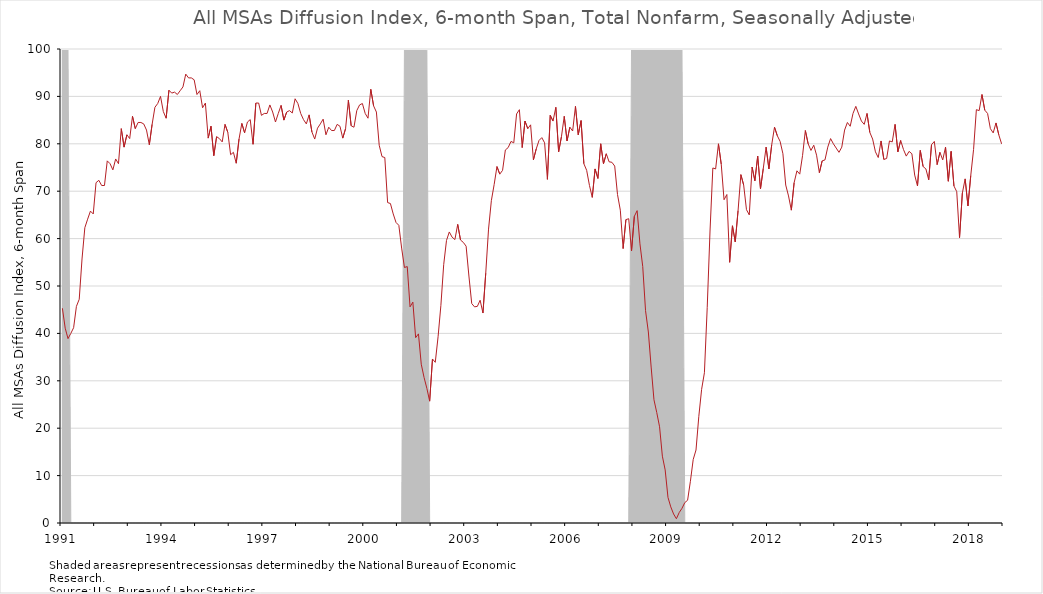
| Category | DI_6month |
|---|---|
| 1991 | 45.3 |
| 1991 | 41.1 |
| 1991 | 38.9 |
| 1991 | 40 |
| 1991 | 41.2 |
| 1991 | 45.7 |
| 1991 | 47.2 |
| 1991 | 55.7 |
| 1991 | 62.3 |
| 1991 | 64.1 |
| 1991 | 65.8 |
| 1991 | 65.2 |
| 1992 | 71.8 |
| 1992 | 72.3 |
| 1992 | 71.2 |
| 1992 | 71.2 |
| 1992 | 76.4 |
| 1992 | 75.8 |
| 1992 | 74.5 |
| 1992 | 76.8 |
| 1992 | 75.8 |
| 1992 | 83.2 |
| 1992 | 79.3 |
| 1992 | 81.9 |
| 1993 | 81.1 |
| 1993 | 85.8 |
| 1993 | 83.2 |
| 1993 | 84.5 |
| 1993 | 84.5 |
| 1993 | 84.2 |
| 1993 | 82.9 |
| 1993 | 79.8 |
| 1993 | 84.1 |
| 1993 | 87.7 |
| 1993 | 88.5 |
| 1993 | 90 |
| 1994 | 86.8 |
| 1994 | 85.4 |
| 1994 | 91.3 |
| 1994 | 90.7 |
| 1994 | 90.9 |
| 1994 | 90.4 |
| 1994 | 91.2 |
| 1994 | 92 |
| 1994 | 94.7 |
| 1994 | 93.9 |
| 1994 | 93.9 |
| 1994 | 93.5 |
| 1995 | 90.4 |
| 1995 | 91.2 |
| 1995 | 87.6 |
| 1995 | 88.6 |
| 1995 | 81.2 |
| 1995 | 83.7 |
| 1995 | 77.5 |
| 1995 | 81.5 |
| 1995 | 81.1 |
| 1995 | 80.4 |
| 1995 | 84.1 |
| 1995 | 82.4 |
| 1996 | 77.7 |
| 1996 | 78.2 |
| 1996 | 75.9 |
| 1996 | 81 |
| 1996 | 84.3 |
| 1996 | 82.3 |
| 1996 | 84.6 |
| 1996 | 85.1 |
| 1996 | 79.9 |
| 1996 | 88.6 |
| 1996 | 88.6 |
| 1996 | 86 |
| 1997 | 86.4 |
| 1997 | 86.4 |
| 1997 | 88.2 |
| 1997 | 86.7 |
| 1997 | 84.6 |
| 1997 | 86.4 |
| 1997 | 88.1 |
| 1997 | 85 |
| 1997 | 86.7 |
| 1997 | 87 |
| 1997 | 86.5 |
| 1997 | 89.5 |
| 1998 | 88.5 |
| 1998 | 86.4 |
| 1998 | 85.1 |
| 1998 | 84.2 |
| 1998 | 86.1 |
| 1998 | 82.5 |
| 1998 | 81 |
| 1998 | 83.3 |
| 1998 | 84.2 |
| 1998 | 85.2 |
| 1998 | 81.9 |
| 1998 | 83.5 |
| 1999 | 82.8 |
| 1999 | 82.8 |
| 1999 | 84.1 |
| 1999 | 83.7 |
| 1999 | 81.2 |
| 1999 | 83.2 |
| 1999 | 89.2 |
| 1999 | 83.8 |
| 1999 | 83.5 |
| 1999 | 87 |
| 1999 | 88.2 |
| 1999 | 88.5 |
| 2000 | 86.4 |
| 2000 | 85.4 |
| 2000 | 91.5 |
| 2000 | 88 |
| 2000 | 86.7 |
| 2000 | 79.7 |
| 2000 | 77.3 |
| 2000 | 77.1 |
| 2000 | 67.6 |
| 2000 | 67.4 |
| 2000 | 65.2 |
| 2000 | 63.4 |
| 2001 | 62.8 |
| 2001 | 58 |
| 2001 | 53.9 |
| 2001 | 54.1 |
| 2001 | 45.6 |
| 2001 | 46.6 |
| 2001 | 39.1 |
| 2001 | 39.9 |
| 2001 | 33.5 |
| 2001 | 30.7 |
| 2001 | 28.4 |
| 2001 | 25.7 |
| 2002 | 34.6 |
| 2002 | 33.9 |
| 2002 | 39.3 |
| 2002 | 45.9 |
| 2002 | 54.5 |
| 2002 | 59.6 |
| 2002 | 61.4 |
| 2002 | 60.3 |
| 2002 | 59.8 |
| 2002 | 63 |
| 2002 | 59.7 |
| 2002 | 59.2 |
| 2003 | 58.4 |
| 2003 | 52.1 |
| 2003 | 46.3 |
| 2003 | 45.6 |
| 2003 | 45.7 |
| 2003 | 47 |
| 2003 | 44.3 |
| 2003 | 52.7 |
| 2003 | 62 |
| 2003 | 68 |
| 2003 | 71.4 |
| 2003 | 75.2 |
| 2004 | 73.6 |
| 2004 | 74.4 |
| 2004 | 78.7 |
| 2004 | 79.2 |
| 2004 | 80.5 |
| 2004 | 80.2 |
| 2004 | 86.3 |
| 2004 | 87.2 |
| 2004 | 79.2 |
| 2004 | 84.8 |
| 2004 | 83.2 |
| 2004 | 84 |
| 2005 | 76.6 |
| 2005 | 78.9 |
| 2005 | 80.7 |
| 2005 | 81.3 |
| 2005 | 80.2 |
| 2005 | 72.5 |
| 2005 | 86 |
| 2005 | 84.8 |
| 2005 | 87.7 |
| 2005 | 78.3 |
| 2005 | 81.5 |
| 2005 | 85.8 |
| 2006 | 80.6 |
| 2006 | 83.5 |
| 2006 | 82.7 |
| 2006 | 87.9 |
| 2006 | 81.9 |
| 2006 | 84.9 |
| 2006 | 75.8 |
| 2006 | 74.4 |
| 2006 | 71.2 |
| 2006 | 68.7 |
| 2006 | 74.7 |
| 2006 | 72.7 |
| 2007 | 80 |
| 2007 | 75.8 |
| 2007 | 77.9 |
| 2007 | 76.2 |
| 2007 | 76.1 |
| 2007 | 75.3 |
| 2007 | 69.3 |
| 2007 | 66 |
| 2007 | 57.9 |
| 2007 | 64 |
| 2007 | 64.2 |
| 2007 | 57.4 |
| 2008 | 64.7 |
| 2008 | 65.9 |
| 2008 | 58.9 |
| 2008 | 54.1 |
| 2008 | 44.8 |
| 2008 | 40.3 |
| 2008 | 32.9 |
| 2008 | 26 |
| 2008 | 23.3 |
| 2008 | 20.3 |
| 2008 | 14.1 |
| 2008 | 11.2 |
| 2009 | 5.4 |
| 2009 | 3.4 |
| 2009 | 1.9 |
| 2009 | 0.9 |
| 2009 | 2.2 |
| 2009 | 3.1 |
| 2009 | 4.3 |
| 2009 | 4.8 |
| 2009 | 8.8 |
| 2009 | 13.4 |
| 2009 | 15.4 |
| 2009 | 22.5 |
| 2010 | 28.2 |
| 2010 | 31.7 |
| 2010 | 45.5 |
| 2010 | 61.6 |
| 2010 | 74.9 |
| 2010 | 74.7 |
| 2010 | 80 |
| 2010 | 75.7 |
| 2010 | 68.2 |
| 2010 | 69.3 |
| 2010 | 55 |
| 2010 | 62.7 |
| 2011 | 59.3 |
| 2011 | 65.9 |
| 2011 | 73.5 |
| 2011 | 71.3 |
| 2011 | 66.1 |
| 2011 | 65 |
| 2011 | 75.1 |
| 2011 | 72.2 |
| 2011 | 77.4 |
| 2011 | 70.5 |
| 2011 | 74.8 |
| 2011 | 79.3 |
| 2012 | 74.7 |
| 2012 | 79.8 |
| 2012 | 83.5 |
| 2012 | 81.7 |
| 2012 | 80.5 |
| 2012 | 77.9 |
| 2012 | 71.3 |
| 2012 | 69 |
| 2012 | 66 |
| 2012 | 71.8 |
| 2012 | 74.3 |
| 2012 | 73.6 |
| 2013 | 77.5 |
| 2013 | 82.8 |
| 2013 | 80 |
| 2013 | 78.6 |
| 2013 | 79.7 |
| 2013 | 77.6 |
| 2013 | 73.9 |
| 2013 | 76.4 |
| 2013 | 76.6 |
| 2013 | 79.3 |
| 2013 | 81.1 |
| 2013 | 80 |
| 2014 | 79.1 |
| 2014 | 78.2 |
| 2014 | 79.3 |
| 2014 | 82.9 |
| 2014 | 84.5 |
| 2014 | 83.7 |
| 2014 | 86.4 |
| 2014 | 87.9 |
| 2014 | 86.3 |
| 2014 | 84.8 |
| 2014 | 84.1 |
| 2014 | 86.4 |
| 2015 | 82.4 |
| 2015 | 81 |
| 2015 | 78.3 |
| 2015 | 77.1 |
| 2015 | 80.6 |
| 2015 | 76.7 |
| 2015 | 76.9 |
| 2015 | 80.6 |
| 2015 | 80.4 |
| 2015 | 84.1 |
| 2015 | 78.3 |
| 2015 | 80.7 |
| 2016 | 78.8 |
| 2016 | 77.4 |
| 2016 | 78.4 |
| 2016 | 77.9 |
| 2016 | 73.4 |
| 2016 | 71.1 |
| 2016 | 78.6 |
| 2016 | 75.2 |
| 2016 | 74.7 |
| 2016 | 72.4 |
| 2016 | 79.8 |
| 2016 | 80.5 |
| 2017 | 75.6 |
| 2017 | 78.2 |
| 2017 | 76.6 |
| 2017 | 79.3 |
| 2017 | 72.1 |
| 2017 | 78.4 |
| 2017 | 71.1 |
| 2017 | 69.9 |
| 2017 | 60.2 |
| 2017 | 69.6 |
| 2017 | 72.6 |
| 2017 | 66.9 |
| 2018 | 73.3 |
| 2018 | 78.8 |
| 2018 | 87.2 |
| 2018 | 87 |
| 2018 | 90.4 |
| 2018 | 87.1 |
| 2018 | 86.4 |
| 2018 | 83.2 |
| 2018 | 82.3 |